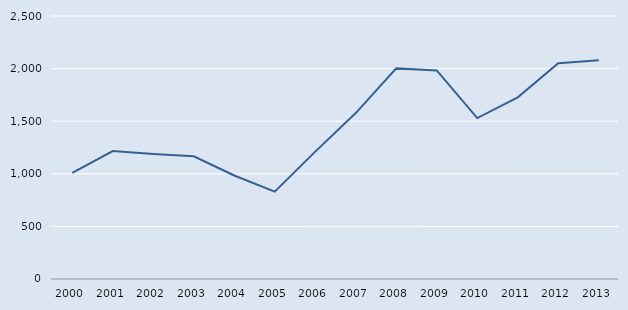
| Category | Series 0 |
|---|---|
| 2000.0 | 1009 |
| 2001.0 | 1216 |
| 2002.0 | 1189 |
| 2003.0 | 1166 |
| 2004.0 | 984 |
| 2005.0 | 830 |
| 2006.0 | 1211 |
| 2007.0 | 1577 |
| 2008.0 | 2002 |
| 2009.0 | 1983 |
| 2010.0 | 1530 |
| 2011.0 | 1727 |
| 2012.0 | 2051 |
| 2013.0 | 2079 |